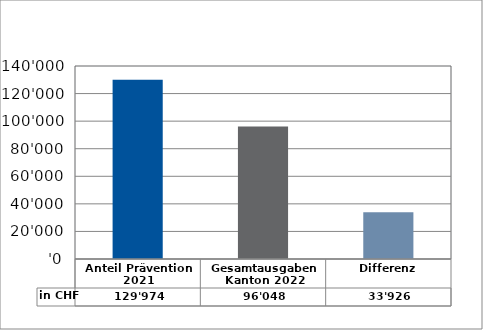
| Category | in CHF |
|---|---|
| Anteil Prävention 2021

 | 129973.6 |
| Gesamtausgaben Kanton 2022
 | 96048 |
| Differenz | 33925.6 |